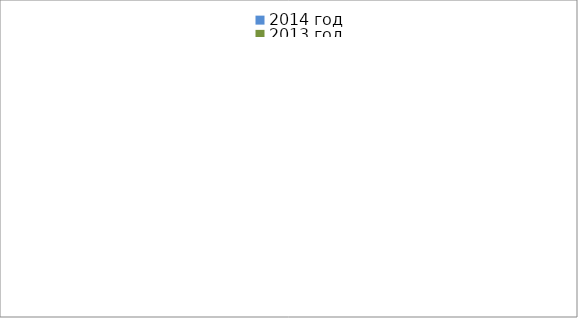
| Category | 2014 год | 2013 год |
|---|---|---|
|  - поджог | 2 | 10 |
|  - неосторожное обращение с огнём | 7 | 8 |
|  - НПТЭ электрооборудования | 2 | 13 |
|  - НПУ и Э печей | 22 | 15 |
|  - НПУ и Э транспортных средств | 22 | 28 |
|   -Шалость с огнем детей | 0 | 1 |
|  -НППБ при эксплуатации эл.приборов | 6 | 11 |
|  - курение | 3 | 3 |
| - прочие | 29 | 19 |
| - не установленные причины | 3 | 1 |